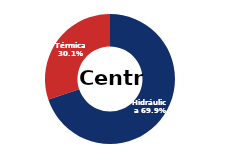
| Category | Centro |
|---|---|
| Eólica | 0 |
| Hidráulica | 2606.349 |
| Solar | 0 |
| Térmica | 1124.392 |